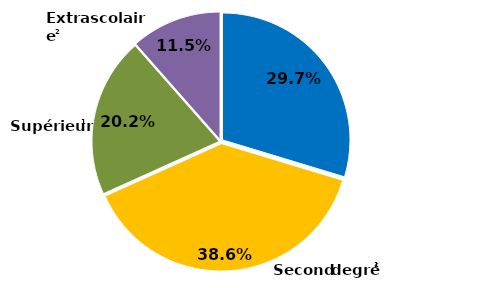
| Category | Series 0 |
|---|---|
| Premier degré | 0.297 |
| Second degré | 0.386 |
| Supérieur | 0.202 |
| Extrascolaire | 0.115 |